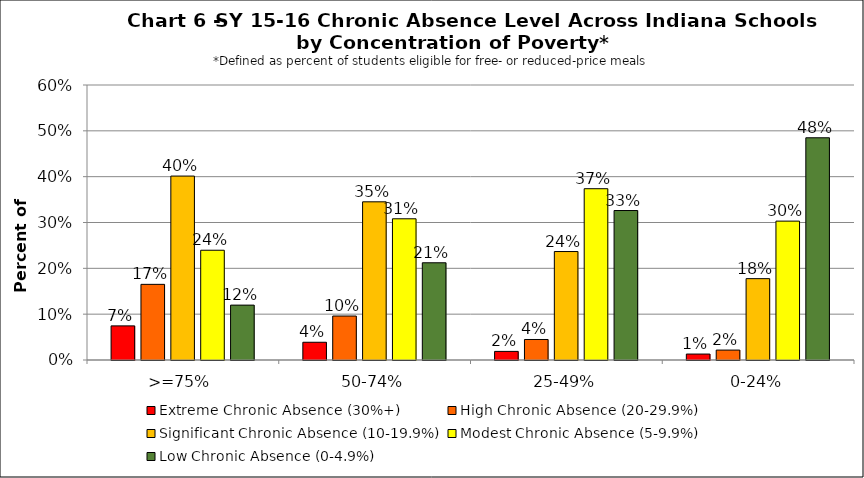
| Category | Extreme Chronic Absence (30%+) | High Chronic Absence (20-29.9%) | Significant Chronic Absence (10-19.9%) | Modest Chronic Absence (5-9.9%) | Low Chronic Absence (0-4.9%) |
|---|---|---|---|---|---|
| 0 | 0.074 | 0.165 | 0.401 | 0.239 | 0.12 |
| 1 | 0.039 | 0.096 | 0.345 | 0.308 | 0.212 |
| 2 | 0.019 | 0.045 | 0.237 | 0.374 | 0.326 |
| 3 | 0.013 | 0.022 | 0.177 | 0.303 | 0.485 |